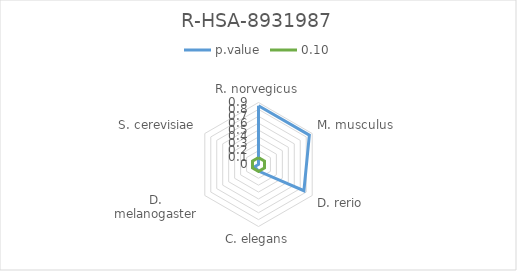
| Category | p.value | 0.10 |
|---|---|---|
| R. norvegicus | 0.852 | 0.1 |
| M. musculus | 0.852 | 0.1 |
| D. rerio | 0.761 | 0.1 |
| C. elegans | 0.095 | 0.1 |
| D. melanogaster | 0.066 | 0.1 |
| S. cerevisiae | 0 | 0.1 |